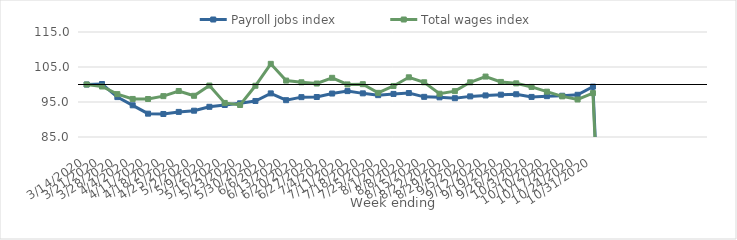
| Category | Payroll jobs index | Total wages index |
|---|---|---|
| 14/03/2020 | 100 | 100 |
| 21/03/2020 | 100.14 | 99.424 |
| 28/03/2020 | 96.401 | 97.248 |
| 04/04/2020 | 94.054 | 95.873 |
| 11/04/2020 | 91.669 | 95.854 |
| 18/04/2020 | 91.575 | 96.674 |
| 25/04/2020 | 92.171 | 98.138 |
| 02/05/2020 | 92.514 | 96.772 |
| 09/05/2020 | 93.624 | 99.692 |
| 16/05/2020 | 94.143 | 94.735 |
| 23/05/2020 | 94.63 | 94.141 |
| 30/05/2020 | 95.294 | 99.641 |
| 06/06/2020 | 97.461 | 105.901 |
| 13/06/2020 | 95.521 | 101.125 |
| 20/06/2020 | 96.385 | 100.632 |
| 27/06/2020 | 96.428 | 100.28 |
| 04/07/2020 | 97.419 | 101.91 |
| 11/07/2020 | 98.115 | 100.026 |
| 18/07/2020 | 97.469 | 100.09 |
| 25/07/2020 | 96.958 | 97.614 |
| 01/08/2020 | 97.304 | 99.577 |
| 08/08/2020 | 97.555 | 102.056 |
| 15/08/2020 | 96.472 | 100.637 |
| 22/08/2020 | 96.337 | 97.363 |
| 29/08/2020 | 96.086 | 98.104 |
| 05/09/2020 | 96.605 | 100.623 |
| 12/09/2020 | 96.877 | 102.267 |
| 19/09/2020 | 97.091 | 100.735 |
| 26/09/2020 | 97.214 | 100.33 |
| 03/10/2020 | 96.448 | 99.309 |
| 10/10/2020 | 96.67 | 97.949 |
| 17/10/2020 | 96.789 | 96.611 |
| 24/10/2020 | 97.062 | 95.716 |
| 31/10/2020 | 99.397 | 97.539 |